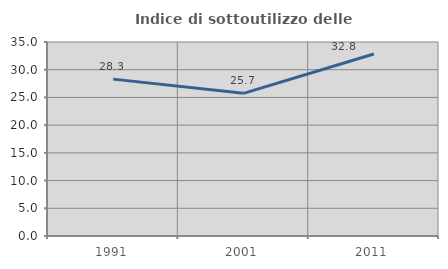
| Category | Indice di sottoutilizzo delle abitazioni  |
|---|---|
| 1991.0 | 28.302 |
| 2001.0 | 25.738 |
| 2011.0 | 32.841 |